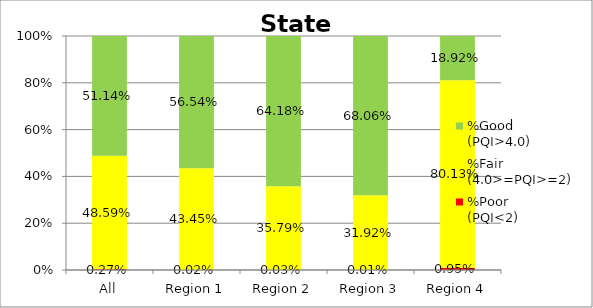
| Category | %Poor
(PQI<2) | %Fair
(4.0>=PQI>=2) | %Good
(PQI>4.0) |
|---|---|---|---|
| All | 0.003 | 0.486 | 0.511 |
| Region 1 | 0 | 0.434 | 0.565 |
| Region 2 | 0 | 0.358 | 0.642 |
| Region 3 | 0 | 0.319 | 0.681 |
| Region 4 | 0.009 | 0.801 | 0.189 |